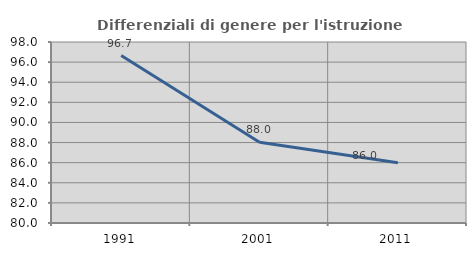
| Category | Differenziali di genere per l'istruzione superiore |
|---|---|
| 1991.0 | 96.657 |
| 2001.0 | 88.036 |
| 2011.0 | 85.988 |